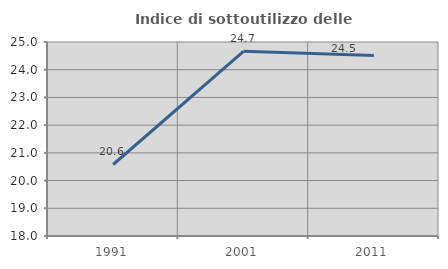
| Category | Indice di sottoutilizzo delle abitazioni  |
|---|---|
| 1991.0 | 20.58 |
| 2001.0 | 24.666 |
| 2011.0 | 24.511 |